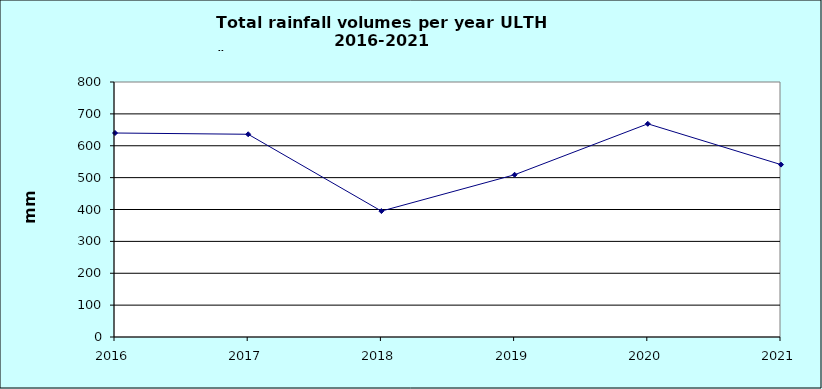
| Category | Series 0 |
|---|---|
| 2016.0 | 640 |
| 2017.0 | 636 |
| 2018.0 | 395 |
| 2019.0 | 509 |
| 2020.0 | 668.8 |
| 2021.0 | 540.8 |